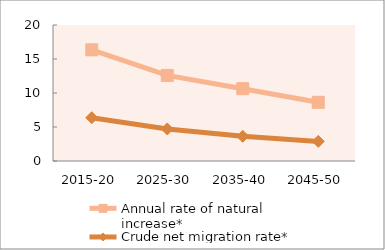
| Category | Annual rate of natural increase* | Crude net migration rate* |
|---|---|---|
| 2015-20 | 16.35 | 6.362 |
| 2025-30 | 12.59 | 4.709 |
| 2035-40 | 10.632 | 3.634 |
| 2045-50 | 8.63 | 2.882 |